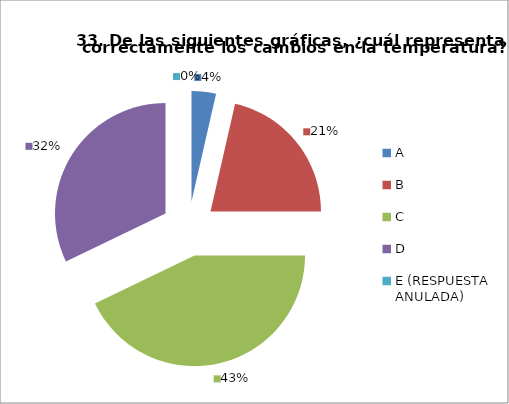
| Category | CANTIDAD DE RESPUESTAS PREGUNTA (33) | PORCENTAJE |
|---|---|---|
| A | 1 | 0.036 |
| B | 6 | 0.214 |
| C | 12 | 0.429 |
| D | 9 | 0.321 |
| E (RESPUESTA ANULADA) | 0 | 0 |